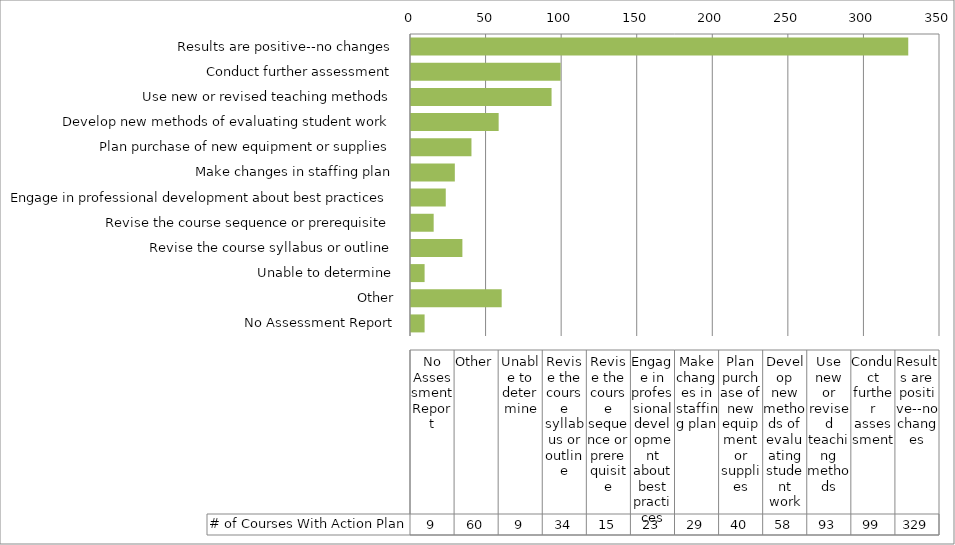
| Category | # of Courses With Action Plan |
|---|---|
| Results are positive--no changes | 329 |
| Conduct further assessment | 99 |
| Use new or revised teaching methods | 93 |
| Develop new methods of evaluating student work | 58 |
| Plan purchase of new equipment or supplies | 40 |
| Make changes in staffing plan | 29 |
| Engage in professional development about best practices | 23 |
| Revise the course sequence or prerequisite | 15 |
| Revise the course syllabus or outline | 34 |
| Unable to determine | 9 |
| Other | 60 |
| No Assessment Report | 9 |